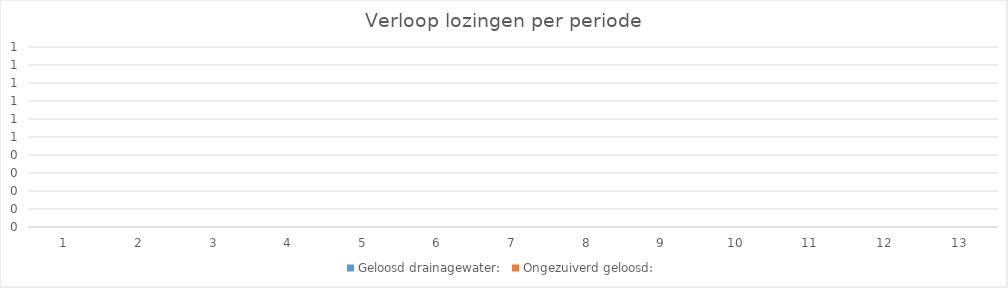
| Category | Geloosd drainagewater: | Ongezuiverd geloosd: |
|---|---|---|
| 0 | 0 | 0 |
| 1 | 0 | 0 |
| 2 | 0 | 0 |
| 3 | 0 | 0 |
| 4 | 0 | 0 |
| 5 | 0 | 0 |
| 6 | 0 | 0 |
| 7 | 0 | 0 |
| 8 | 0 | 0 |
| 9 | 0 | 0 |
| 10 | 0 | 0 |
| 11 | 0 | 0 |
| 12 | 0 | 0 |